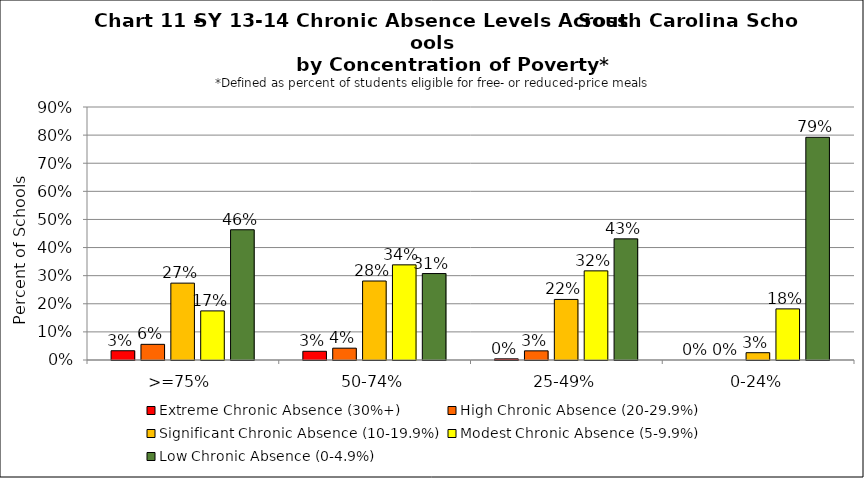
| Category | Extreme Chronic Absence (30%+) | High Chronic Absence (20-29.9%) | Significant Chronic Absence (10-19.9%) | Modest Chronic Absence (5-9.9%) | Low Chronic Absence (0-4.9%) |
|---|---|---|---|---|---|
| 0 | 0.033 | 0.056 | 0.273 | 0.175 | 0.463 |
| 1 | 0.031 | 0.042 | 0.281 | 0.338 | 0.308 |
| 2 | 0.004 | 0.033 | 0.215 | 0.317 | 0.431 |
| 3 | 0 | 0 | 0.026 | 0.182 | 0.792 |